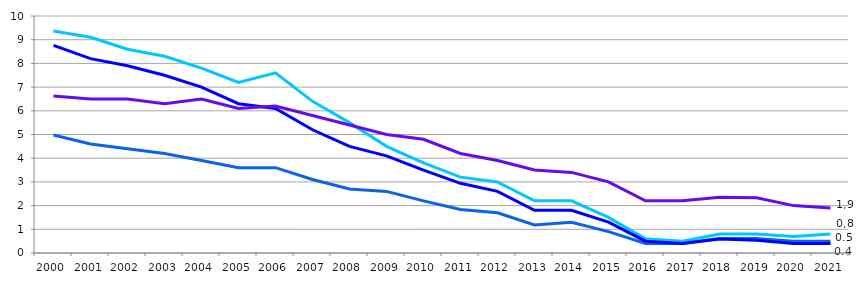
| Category | Sixième générale | Cinquième générale | Quatrième générale | Troisième générale |
|---|---|---|---|---|
| 2000.0 | 9.365 | 4.978 | 8.761 | 6.62 |
| 2001.0 | 9.1 | 4.6 | 8.2 | 6.5 |
| 2002.0 | 8.6 | 4.4 | 7.9 | 6.5 |
| 2003.0 | 8.3 | 4.2 | 7.5 | 6.3 |
| 2004.0 | 7.8 | 3.9 | 7 | 6.5 |
| 2005.0 | 7.2 | 3.6 | 6.3 | 6.1 |
| 2006.0 | 7.6 | 3.6 | 6.1 | 6.2 |
| 2007.0 | 6.4 | 3.1 | 5.2 | 5.8 |
| 2008.0 | 5.5 | 2.7 | 4.5 | 5.4 |
| 2009.0 | 4.5 | 2.6 | 4.1 | 5 |
| 2010.0 | 3.8 | 2.2 | 3.5 | 4.8 |
| 2011.0 | 3.2 | 1.84 | 2.94 | 4.2 |
| 2012.0 | 3 | 1.7 | 2.6 | 3.9 |
| 2013.0 | 2.2 | 1.18 | 1.8 | 3.5 |
| 2014.0 | 2.2 | 1.3 | 1.8 | 3.4 |
| 2015.0 | 1.5 | 0.9 | 1.3 | 3 |
| 2016.0 | 0.6 | 0.4 | 0.5 | 2.2 |
| 2017.0 | 0.5 | 0.4 | 0.4 | 2.2 |
| 2018.0 | 0.8 | 0.61 | 0.59 | 2.35 |
| 2019.0 | 0.8 | 0.61 | 0.54 | 2.33 |
| 2020.0 | 0.7 | 0.5 | 0.4 | 2 |
| 2021.0 | 0.8 | 0.5 | 0.4 | 1.9 |